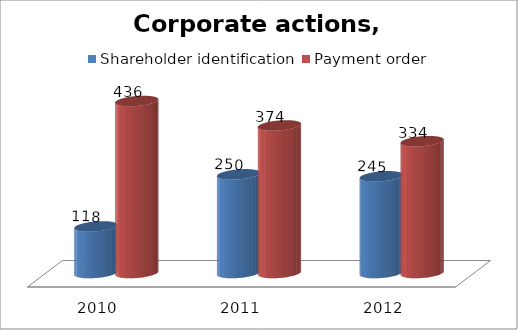
| Category | Shareholder identification | Payment order |
|---|---|---|
| 2010.0 | 118 | 436 |
| 2011.0 | 250 | 374 |
| 2012.0 | 245 | 334 |